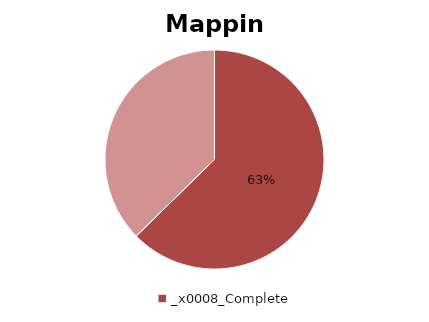
| Category | Series 0 |
|---|---|
| 0 | 47 |
| 1 | 28 |